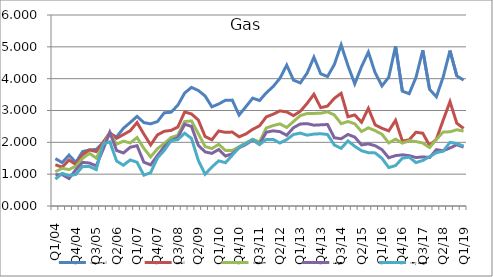
| Category | Very Small | Small | Medium | Large | Very Large |
|---|---|---|---|---|---|
| Q1/04 | 1.488 | 1.295 | 1.078 | 0.982 | 0.844 |
| Q2/04 | 1.363 | 1.221 | 1.185 | 0.987 | 1.025 |
| Q3/04 | 1.598 | 1.445 | 1.144 | 0.862 | 0.953 |
| Q4/04  | 1.37 | 1.303 | 1.25 | 1.14 | 0.992 |
| Q1/05  | 1.709 | 1.612 | 1.495 | 1.37 | 1.242 |
| Q2/05  | 1.761 | 1.761 | 1.656 | 1.35 | 1.243 |
| Q3/05  | 1.777 | 1.709 | 1.505 | 1.26 | 1.143 |
| Q4/05  | 1.989 | 1.993 | 1.897 | 1.769 | 1.945 |
| Q1/06  | 2.266 | 2.303 | 2.282 | 2.317 | 2.016 |
| Q2/06  | 2.173 | 2.126 | 1.941 | 1.743 | 1.412 |
| Q3/06  | 2.442 | 2.244 | 2.037 | 1.666 | 1.281 |
| Q4/06  | 2.623 | 2.364 | 1.982 | 1.847 | 1.447 |
| Q1/07  | 2.816 | 2.621 | 2.151 | 1.894 | 1.374 |
| Q2/07  | 2.621 | 2.26 | 1.811 | 1.376 | 0.968 |
| Q3/07  | 2.58 | 1.919 | 1.543 | 1.291 | 1.048 |
| Q4/07  | 2.651 | 2.234 | 1.8 | 1.588 | 1.512 |
| Q1/08  | 2.927 | 2.347 | 1.962 | 1.862 | 1.743 |
| Q2/08  | 2.945 | 2.375 | 2.15 | 2.059 | 2.053 |
| Q3/08  | 3.168 | 2.48 | 2.222 | 2.148 | 2.085 |
| Q4/08  | 3.548 | 2.954 | 2.651 | 2.566 | 2.286 |
| Q1/09  | 3.727 | 2.892 | 2.672 | 2.501 | 2.124 |
| Q2/09  | 3.63 | 2.703 | 2.276 | 1.909 | 1.436 |
| Q3/09  | 3.458 | 2.184 | 1.869 | 1.7 | 0.998 |
| Q4/09  | 3.116 | 2.079 | 1.803 | 1.653 | 1.224 |
| Q1/10  | 3.205 | 2.357 | 1.94 | 1.775 | 1.418 |
| Q2/10  | 3.322 | 2.314 | 1.742 | 1.568 | 1.361 |
| Q3/10  | 3.326 | 2.323 | 1.742 | 1.642 | 1.593 |
| Q4/10  | 2.857 | 2.173 | 1.863 | 1.827 | 1.84 |
| Q1/11  | 3.12 | 2.263 | 1.982 | 1.933 | 1.959 |
| Q2/11  | 3.388 | 2.409 | 2.094 | 2.072 | 2.091 |
| Q3/11  | 3.313 | 2.518 | 2.012 | 1.939 | 1.933 |
| Q4/11  | 3.555 | 2.799 | 2.451 | 2.317 | 2.089 |
| Q1/12  | 3.752 | 2.883 | 2.525 | 2.361 | 2.093 |
| Q2/12  | 4.009 | 2.988 | 2.579 | 2.336 | 1.978 |
| Q3/12  | 4.425 | 2.955 | 2.466 | 2.222 | 2.087 |
| Q4/12  | 3.953 | 2.839 | 2.655 | 2.461 | 2.247 |
| Q1/13  | 3.867 | 2.977 | 2.84 | 2.577 | 2.29 |
| Q2/13  | 4.175 | 3.223 | 2.906 | 2.588 | 2.224 |
| Q3/13  | 4.673 | 3.511 | 2.908 | 2.539 | 2.259 |
| Q4/13  | 4.153 | 3.089 | 2.914 | 2.55 | 2.27 |
| Q1/14  | 4.067 | 3.14 | 2.959 | 2.56 | 2.246 |
| Q2/14  | 4.445 | 3.383 | 2.859 | 2.144 | 1.916 |
| Q3/14  | 5.063 | 3.54 | 2.586 | 2.111 | 1.812 |
| Q4/14  | 4.411 | 2.803 | 2.654 | 2.247 | 2.044 |
| Q1/15  | 3.837 | 2.861 | 2.584 | 2.165 | 1.875 |
| Q2/15  | 4.378 | 2.63 | 2.339 | 1.919 | 1.737 |
| Q3/15  | 4.832 | 3.068 | 2.456 | 1.952 | 1.674 |
| Q4/15  | 4.184 | 2.549 | 2.367 | 1.894 | 1.668 |
| Q1/16  | 3.773 | 2.441 | 2.254 | 1.771 | 1.497 |
| Q2/16  | 4.046 | 2.361 | 1.981 | 1.514 | 1.208 |
| Q3/16  | 5.021 | 2.692 | 2.101 | 1.584 | 1.27 |
| Q4/16  | 3.606 | 2.04 | 1.974 | 1.607 | 1.502 |
| Q1/17  | 3.529 | 2.079 | 2.05 | 1.583 | 1.536 |
| Q2/17  | 4.037 | 2.318 | 2.024 | 1.522 | 1.363 |
| Q3/17  | 4.892 | 2.286 | 1.978 | 1.543 | 1.43 |
| Q4/17  | 3.665 | 1.9 | 1.836 | 1.522 | 1.55 |
| Q1/18  | 3.43 | 2.099 | 2.09 | 1.77 | 1.675 |
| Q2/18  | 4.053 | 2.697 | 2.325 | 1.736 | 1.721 |
| Q3/18  | 4.883 | 3.277 | 2.33 | 1.822 | 1.999 |
| Q4/18  | 4.088 | 2.601 | 2.395 | 1.924 | 1.962 |
| Q1/19  | 3.953 | 2.437 | 2.355 | 1.849 | 1.881 |